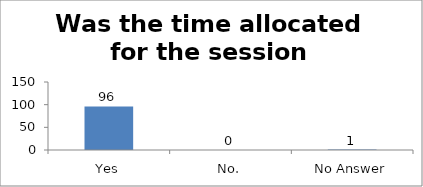
| Category | Was the time allocated for the session sufficient? |
|---|---|
| Yes | 96 |
| No. | 0 |
| No Answer | 1 |